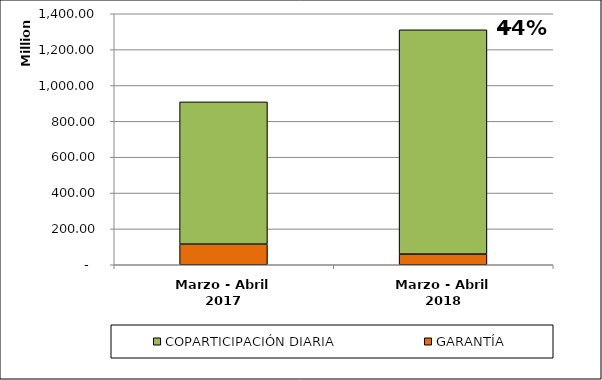
| Category | GARANTÍA | COPARTICIPACIÓN DIARIA |
|---|---|---|
| Marzo - Abril 2017 | 114859053.3 | 793541846.03 |
| Marzo - Abril 2018 | 59390017.66 | 1251132491.01 |